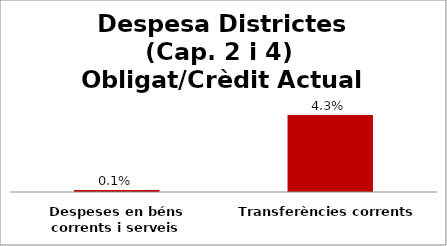
| Category | Series 0 |
|---|---|
| Despeses en béns corrents i serveis | 0.001 |
| Transferències corrents | 0.043 |